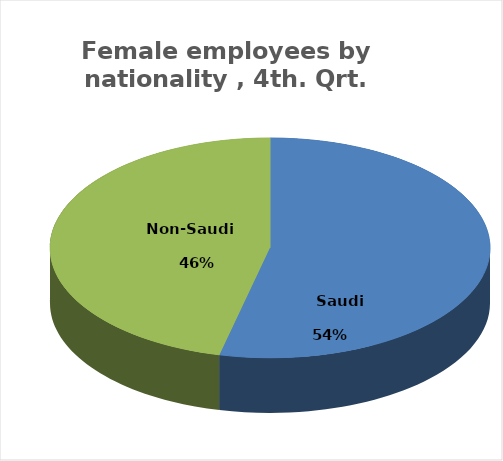
| Category | Series 0 |
|---|---|
|        Saudi      | 154584 |
|          Non-Saudi        | 133358 |